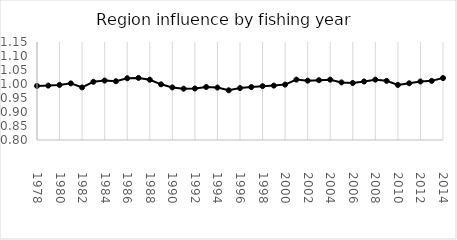
| Category | Series 0 |
|---|---|
| 1978.0 | 0.993 |
| 1979.0 | 0.994 |
| 1980.0 | 0.997 |
| 1981.0 | 1.002 |
| 1982.0 | 0.988 |
| 1983.0 | 1.008 |
| 1984.0 | 1.012 |
| 1985.0 | 1.01 |
| 1986.0 | 1.02 |
| 1987.0 | 1.022 |
| 1988.0 | 1.015 |
| 1989.0 | 0.999 |
| 1990.0 | 0.988 |
| 1991.0 | 0.983 |
| 1992.0 | 0.984 |
| 1993.0 | 0.989 |
| 1994.0 | 0.987 |
| 1995.0 | 0.978 |
| 1996.0 | 0.985 |
| 1997.0 | 0.989 |
| 1998.0 | 0.992 |
| 1999.0 | 0.994 |
| 2000.0 | 0.998 |
| 2001.0 | 1.016 |
| 2002.0 | 1.012 |
| 2003.0 | 1.014 |
| 2004.0 | 1.015 |
| 2005.0 | 1.006 |
| 2006.0 | 1.004 |
| 2007.0 | 1.009 |
| 2008.0 | 1.016 |
| 2009.0 | 1.011 |
| 2010.0 | 0.997 |
| 2011.0 | 1.003 |
| 2012.0 | 1.009 |
| 2013.0 | 1.011 |
| 2014.0 | 1.021 |